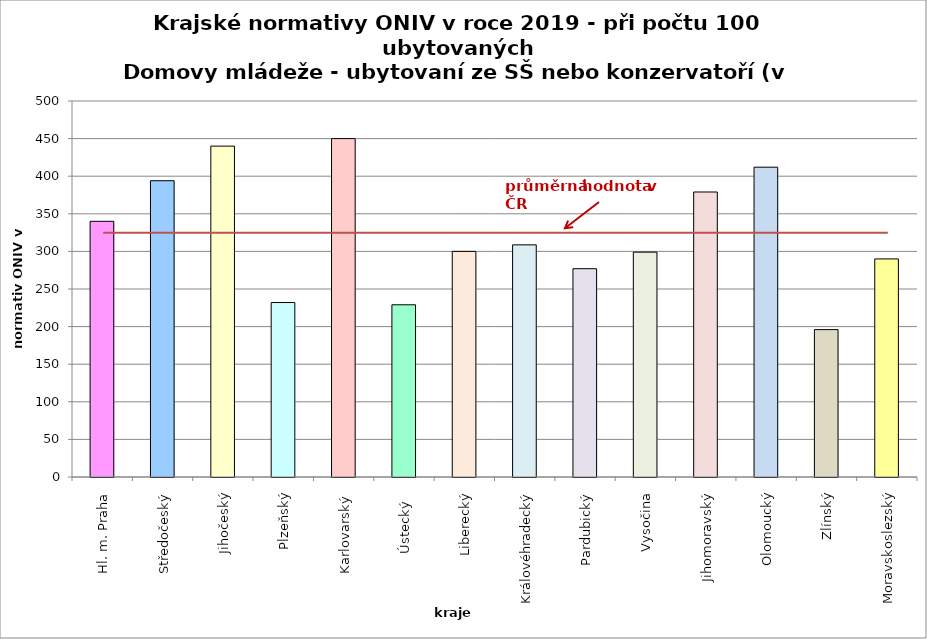
| Category | Series 0 |
|---|---|
| Hl. m. Praha | 340 |
| Středočeský | 394 |
| Jihočeský | 440 |
| Plzeňský | 232 |
| Karlovarský  | 450 |
| Ústecký   | 229 |
| Liberecký | 300 |
| Královéhradecký | 308.7 |
| Pardubický | 277 |
| Vysočina | 299 |
| Jihomoravský | 379 |
| Olomoucký | 412 |
| Zlínský | 196 |
| Moravskoslezský | 290 |